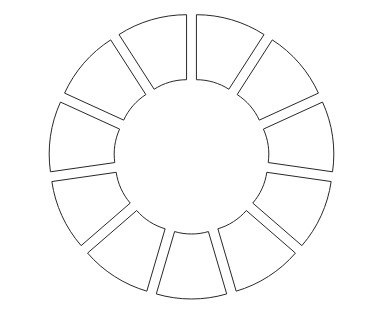
| Category | Series 0 |
|---|---|
| 0 | 0 |
| 1 | 0 |
| 2 | 0 |
| 3 | 0 |
| 4 | 0 |
| 5 | 1 |
| 6 | 0 |
| 7 | 0 |
| 8 | 0 |
| 9 | 0 |
| 10 | 0 |
| 11 | 1 |
| 12 | 0 |
| 13 | 0 |
| 14 | 0 |
| 15 | 0 |
| 16 | 0 |
| 17 | 1 |
| 18 | 0 |
| 19 | 0 |
| 20 | 0 |
| 21 | 0 |
| 22 | 0 |
| 23 | 1 |
| 24 | 0 |
| 25 | 0 |
| 26 | 0 |
| 27 | 0 |
| 28 | 0 |
| 29 | 1 |
| 30 | 0 |
| 31 | 0 |
| 32 | 0 |
| 33 | 0 |
| 34 | 0 |
| 35 | 1 |
| 36 | 0 |
| 37 | 0 |
| 38 | 0 |
| 39 | 0 |
| 40 | 0 |
| 41 | 1 |
| 42 | 0 |
| 43 | 0 |
| 44 | 0 |
| 45 | 0 |
| 46 | 0 |
| 47 | 1 |
| 48 | 0 |
| 49 | 0 |
| 50 | 0 |
| 51 | 0 |
| 52 | 0 |
| 53 | 1 |
| 54 | 0 |
| 55 | 0 |
| 56 | 0 |
| 57 | 0 |
| 58 | 0 |
| 59 | 1 |
| 60 | 0 |
| 61 | 0 |
| 62 | 0 |
| 63 | 0 |
| 64 | 0 |
| 65 | 1 |